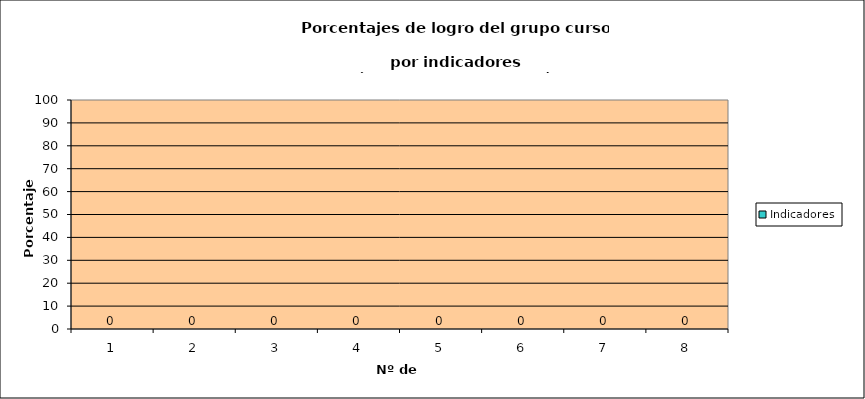
| Category | Indicadores |
|---|---|
| 0 | 0 |
| 1 | 0 |
| 2 | 0 |
| 3 | 0 |
| 4 | 0 |
| 5 | 0 |
| 6 | 0 |
| 7 | 0 |